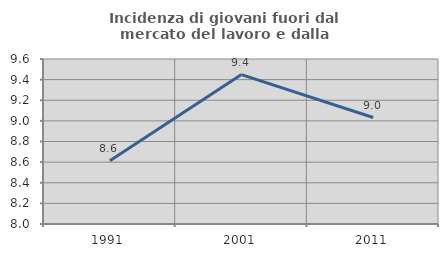
| Category | Incidenza di giovani fuori dal mercato del lavoro e dalla formazione  |
|---|---|
| 1991.0 | 8.612 |
| 2001.0 | 9.449 |
| 2011.0 | 9.032 |